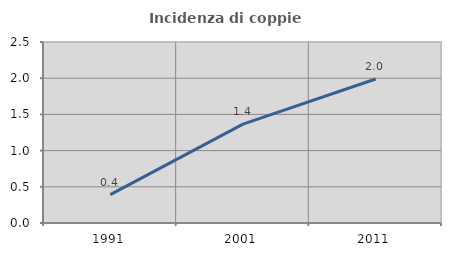
| Category | Incidenza di coppie miste |
|---|---|
| 1991.0 | 0.391 |
| 2001.0 | 1.365 |
| 2011.0 | 1.989 |